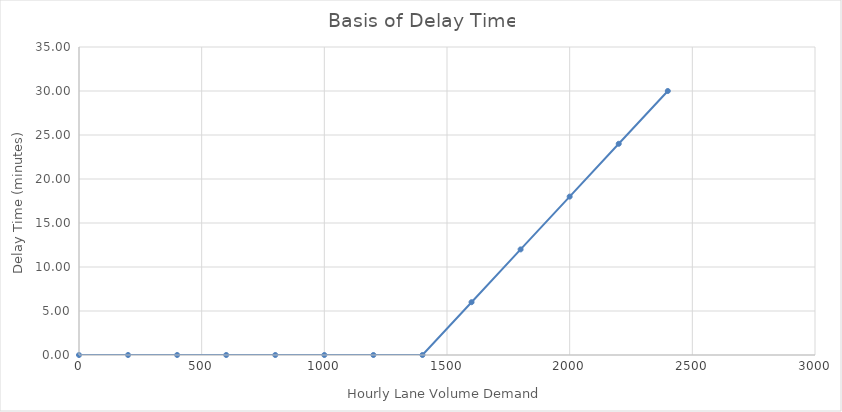
| Category | Series 0 |
|---|---|
| 0.0 | 0 |
| 200.0 | 0 |
| 400.0 | 0 |
| 600.0 | 0 |
| 800.0 | 0 |
| 1000.0 | 0 |
| 1200.0 | 0 |
| 1400.0 | 0 |
| 1600.0 | 6 |
| 1800.0 | 12 |
| 2000.0 | 18 |
| 2200.0 | 24 |
| 2400.0 | 30 |